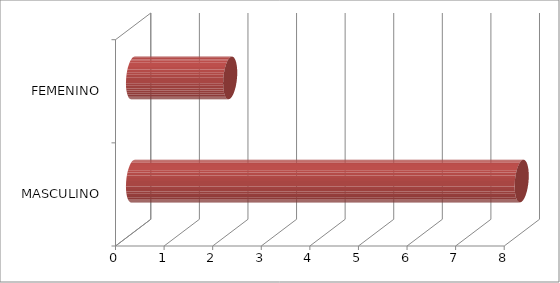
| Category | Series 0 |
|---|---|
| MASCULINO | 8 |
| FEMENINO | 2 |